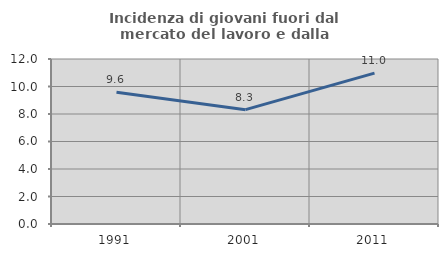
| Category | Incidenza di giovani fuori dal mercato del lavoro e dalla formazione  |
|---|---|
| 1991.0 | 9.582 |
| 2001.0 | 8.316 |
| 2011.0 | 10.971 |